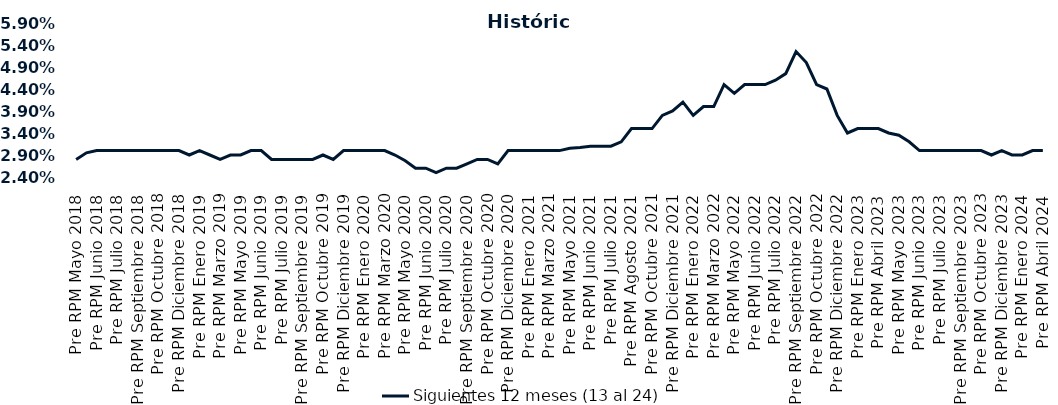
| Category | Siguientes 12 meses (13 al 24)  |
|---|---|
| Pre RPM Mayo 2018 | 0.028 |
| Post RPM Mayo 2018 | 0.03 |
| Pre RPM Junio 2018 | 0.03 |
| Post RPM Junio 2018 | 0.03 |
| Pre RPM Julio 2018 | 0.03 |
| Post RPM Julio 2018 | 0.03 |
| Pre RPM Septiembre 2018 | 0.03 |
| Post RPM Septiembre 2018 | 0.03 |
| Pre RPM Octubre 2018 | 0.03 |
| Post RPM Octubre 2018 | 0.03 |
| Pre RPM Diciembre 2018 | 0.03 |
| Post RPM Diciembre 2018 | 0.029 |
| Pre RPM Enero 2019 | 0.03 |
| Post RPM Enero 2019 | 0.029 |
| Pre RPM Marzo 2019 | 0.028 |
| Post RPM Marzo 2019 | 0.029 |
| Pre RPM Mayo 2019 | 0.029 |
| Post RPM Mayo 2019 | 0.03 |
| Pre RPM Junio 2019 | 0.03 |
| Post RPM Junio 2019 | 0.028 |
| Pre RPM Julio 2019 | 0.028 |
| Post RPM Julio 2019 | 0.028 |
| Pre RPM Septiembre 2019 | 0.028 |
| Post RPM Septiembre 2019 | 0.028 |
| Pre RPM Octubre 2019 | 0.029 |
| Post RPM Octubre 2019 | 0.028 |
| Pre RPM Diciembre 2019 | 0.03 |
| Post RPM Diciembre 2019 | 0.03 |
| Pre RPM Enero 2020 | 0.03 |
| Post RPM Enero 2020 | 0.03 |
| Pre RPM Marzo 2020 | 0.03 |
| Post RPM Marzo 2020 | 0.029 |
| Pre RPM Mayo 2020 | 0.028 |
| Post RPM Mayo 2020 | 0.026 |
| Pre RPM Junio 2020 | 0.026 |
| Post RPM Junio 2020 | 0.025 |
| Pre RPM Julio 2020 | 0.026 |
| Post RPM Julio 2020 | 0.026 |
| Pre RPM Septiembre 2020 | 0.027 |
| Post RPM Septiembre 2020 | 0.028 |
| Pre RPM Octubre 2020 | 0.028 |
| Post RPM Octubre 2020 | 0.027 |
| Pre RPM Diciembre 2020 | 0.03 |
| Post RPM Diciembre 2020 | 0.03 |
| Pre RPM Enero 2021 | 0.03 |
| Post RPM Enero 2021 | 0.03 |
| Pre RPM Marzo 2021 | 0.03 |
| Post RPM Marzo 2021 | 0.03 |
| Pre RPM Mayo 2021 | 0.031 |
| Post RPM Mayo 2021 | 0.031 |
| Pre RPM Junio 2021 | 0.031 |
| Post RPM Junio 2021 | 0.031 |
| Pre RPM Julio 2021 | 0.031 |
| Post RPM Julio 2021 | 0.032 |
| Pre RPM Agosto 2021 | 0.035 |
| Post RPM Agosto 2021 | 0.035 |
| Pre RPM Octubre 2021 | 0.035 |
| Post RPM Octubre 2021 | 0.038 |
| Pre RPM Diciembre 2021 | 0.039 |
| Post RPM Diciembre 2021 | 0.041 |
| Pre RPM Enero 2022 | 0.038 |
| Post RPM Enero 2022 | 0.04 |
| Pre RPM Marzo 2022 | 0.04 |
| Post RPM Marzo 2022 | 0.045 |
| Pre RPM Mayo 2022 | 0.043 |
| Post RPM Mayo 2022 | 0.045 |
| Pre RPM Junio 2022 | 0.045 |
| Post RPM Junio 2022 | 0.045 |
| Pre RPM Julio 2022 | 0.046 |
| Post RPM Julio 2022 | 0.048 |
| Pre RPM Septiembre 2022 | 0.052 |
| Post RPM Septiembre 2022 | 0.05 |
| Pre RPM Octubre 2022 | 0.045 |
| Post RPM Octubre 2022 | 0.044 |
| Pre RPM Diciembre 2022 | 0.038 |
| Post RPM Diciembre 2022 | 0.034 |
| Pre RPM Enero 2023 | 0.035 |
| Post RPM Enero 2023 | 0.035 |
| Pre RPM Abril 2023 | 0.035 |
| Post RPM Abril 2023 | 0.034 |
| Pre RPM Mayo 2023 | 0.034 |
| Post RPM Mayo 2023 | 0.032 |
| Pre RPM Junio 2023 | 0.03 |
| Post RPM Junio 2023 | 0.03 |
| Pre RPM Julio 2023 | 0.03 |
| Post RPM Julio 2023 | 0.03 |
| Pre RPM Septiembre 2023 | 0.03 |
| Post RPM Septiembre 2023 | 0.03 |
| Pre RPM Octubre 2023 | 0.03 |
| Post RPM Octubre 2023 | 0.029 |
| Pre RPM Diciembre 2023 | 0.03 |
| Post RPM Diciembre 2023 | 0.029 |
| Pre RPM Enero 2024 | 0.029 |
| Post RPM Enero 2024 | 0.03 |
| Pre RPM Abril 2024 | 0.03 |